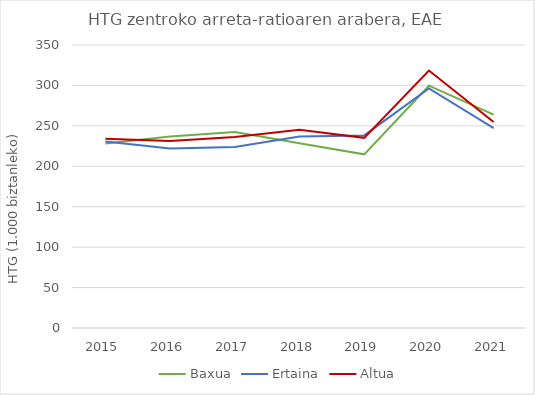
| Category | Baxua | Ertaina | Altua |
|---|---|---|---|
| 2015.0 | 228.167 | 230.742 | 234.075 |
| 2016.0 | 236.809 | 222.073 | 231.408 |
| 2017.0 | 242.465 | 223.785 | 236.148 |
| 2018.0 | 228.483 | 236.893 | 245.087 |
| 2019.0 | 214.778 | 238.22 | 235.191 |
| 2020.0 | 299.664 | 296.249 | 318.438 |
| 2021.0 | 263.816 | 247.097 | 254.861 |